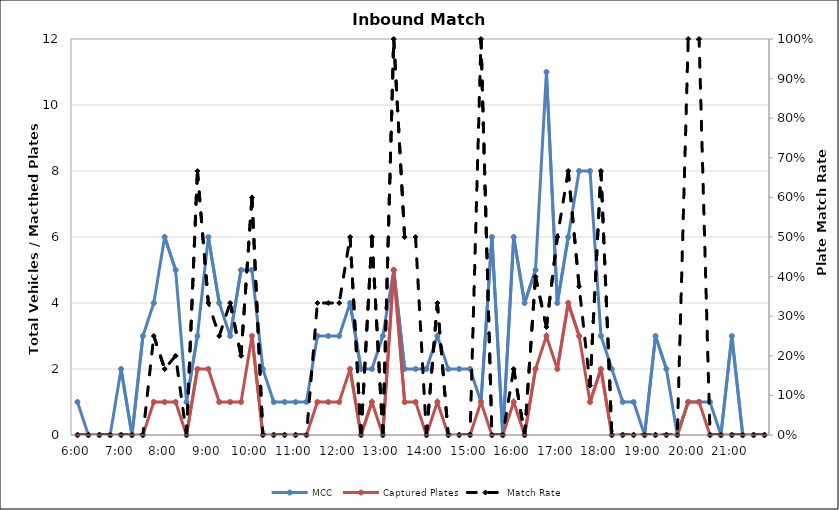
| Category | MCC | Captured Plates |
|---|---|---|
| 0.25 | 1 | 0 |
| 0.260416666666667 | 0 | 0 |
| 0.270833333333333 | 0 | 0 |
| 0.28125 | 0 | 0 |
| 0.291666666666667 | 2 | 0 |
| 0.302083333333333 | 0 | 0 |
| 0.3125 | 3 | 0 |
| 0.322916666666667 | 4 | 1 |
| 0.333333333333333 | 6 | 1 |
| 0.34375 | 5 | 1 |
| 0.354166666666667 | 1 | 0 |
| 0.364583333333333 | 3 | 2 |
| 0.375 | 6 | 2 |
| 0.385416666666667 | 4 | 1 |
| 0.395833333333333 | 3 | 1 |
| 0.40625 | 5 | 1 |
| 0.416666666666667 | 5 | 3 |
| 0.427083333333333 | 2 | 0 |
| 0.4375 | 1 | 0 |
| 0.447916666666667 | 1 | 0 |
| 0.458333333333333 | 1 | 0 |
| 0.46875 | 1 | 0 |
| 0.479166666666667 | 3 | 1 |
| 0.489583333333333 | 3 | 1 |
| 0.5 | 3 | 1 |
| 0.510416666666667 | 4 | 2 |
| 0.520833333333333 | 2 | 0 |
| 0.53125 | 2 | 1 |
| 0.541666666666667 | 3 | 0 |
| 0.552083333333333 | 5 | 5 |
| 0.5625 | 2 | 1 |
| 0.572916666666667 | 2 | 1 |
| 0.583333333333333 | 2 | 0 |
| 0.59375 | 3 | 1 |
| 0.604166666666667 | 2 | 0 |
| 0.614583333333333 | 2 | 0 |
| 0.625 | 2 | 0 |
| 0.635416666666667 | 1 | 1 |
| 0.645833333333333 | 6 | 0 |
| 0.65625 | 0 | 0 |
| 0.666666666666667 | 6 | 1 |
| 0.677083333333333 | 4 | 0 |
| 0.6875 | 5 | 2 |
| 0.697916666666667 | 11 | 3 |
| 0.708333333333333 | 4 | 2 |
| 0.71875 | 6 | 4 |
| 0.729166666666667 | 8 | 3 |
| 0.739583333333333 | 8 | 1 |
| 0.75 | 3 | 2 |
| 0.760416666666667 | 2 | 0 |
| 0.770833333333333 | 1 | 0 |
| 0.78125 | 1 | 0 |
| 0.791666666666667 | 0 | 0 |
| 0.802083333333333 | 3 | 0 |
| 0.8125 | 2 | 0 |
| 0.822916666666667 | 0 | 0 |
| 0.833333333333333 | 1 | 1 |
| 0.84375 | 1 | 1 |
| 0.854166666666667 | 1 | 0 |
| 0.864583333333333 | 0 | 0 |
| 0.875 | 3 | 0 |
| 0.885416666666667 | 0 | 0 |
| 0.895833333333333 | 0 | 0 |
| 0.90625 | 0 | 0 |